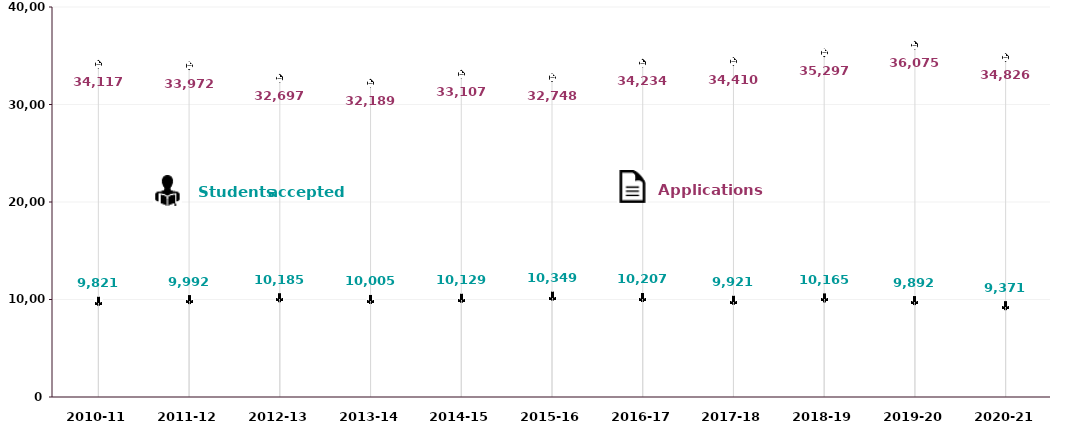
| Category | Applications | Students Accepted |
|---|---|---|
| 2010-11 | 34117 | 9821 |
| 2011-12 | 33972 | 9992 |
| 2012-13 | 32697 | 10185 |
| 2013-14 | 32189 | 10005 |
| 2014-15 | 33107 | 10129 |
| 2015-16 | 32748 | 10349 |
| 2016-17 | 34234 | 10207 |
| 2017-18 | 34410 | 9921 |
| 2018-19 | 35297 | 10165 |
| 2019-20 | 36075 | 9892 |
| 2020-21 | 34826 | 9371 |